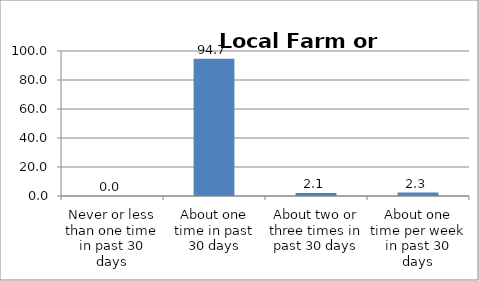
| Category | Series 0 |
|---|---|
| Never or less than one time in past 30 days | 0 |
| About one time in past 30 days | 94.676 |
| About two or three times in past 30 days | 2.144 |
| About one time per week in past 30 days | 2.347 |